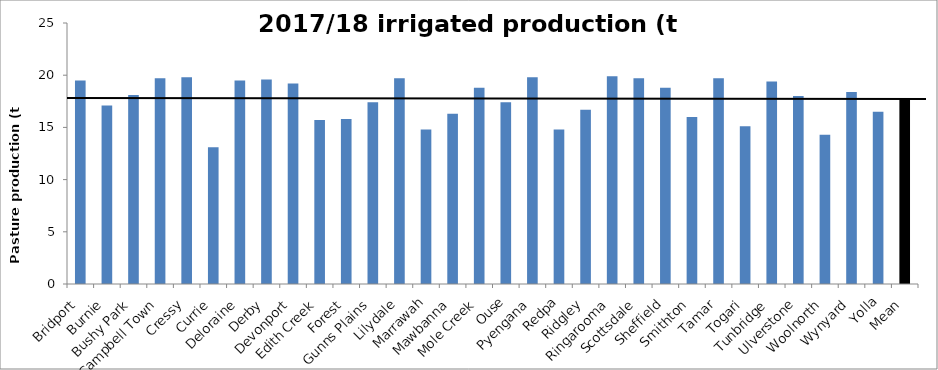
| Category | 2017/18 irrigated production (t DM/ha) |
|---|---|
| Bridport | 19.5 |
| Burnie | 17.1 |
| Bushy Park | 18.1 |
| Campbell Town | 19.7 |
| Cressy | 19.8 |
| Currie | 13.1 |
| Deloraine | 19.5 |
| Derby | 19.6 |
| Devonport | 19.2 |
| Edith Creek | 15.7 |
| Forest | 15.8 |
| Gunns Plains | 17.4 |
| Lilydale | 19.7 |
| Marrawah | 14.8 |
| Mawbanna | 16.3 |
| Mole Creek | 18.8 |
| Ouse | 17.4 |
| Pyengana | 19.8 |
| Redpa | 14.8 |
| Ridgley | 16.7 |
| Ringarooma | 19.9 |
| Scottsdale | 19.7 |
| Sheffield | 18.8 |
| Smithton | 16 |
| Tamar | 19.7 |
| Togari | 15.1 |
| Tunbridge | 19.4 |
| Ulverstone | 18 |
| Woolnorth | 14.3 |
| Wynyard | 18.4 |
| Yolla | 16.5 |
| Mean | 17.697 |